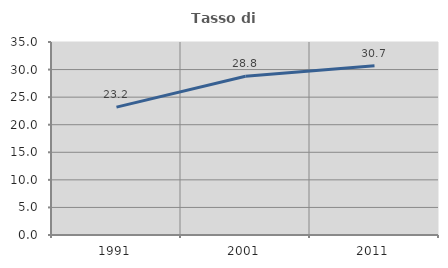
| Category | Tasso di occupazione   |
|---|---|
| 1991.0 | 23.19 |
| 2001.0 | 28.783 |
| 2011.0 | 30.679 |